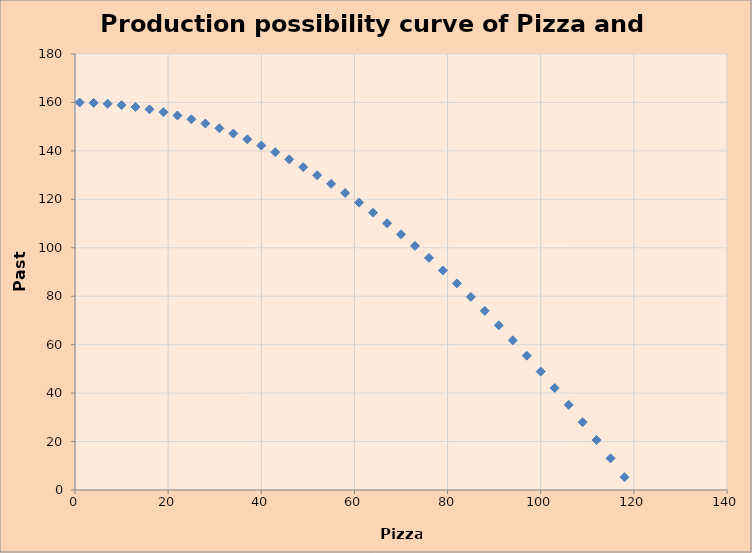
| Category | Y |
|---|---|
| 1.0 | 159.989 |
| 4.0 | 159.822 |
| 7.0 | 159.456 |
| 10.0 | 158.889 |
| 13.0 | 158.122 |
| 16.0 | 157.156 |
| 19.0 | 155.989 |
| 22.0 | 154.622 |
| 25.0 | 153.056 |
| 28.0 | 151.289 |
| 31.0 | 149.322 |
| 34.0 | 147.156 |
| 37.0 | 144.789 |
| 40.0 | 142.222 |
| 43.0 | 139.456 |
| 46.0 | 136.489 |
| 49.0 | 133.322 |
| 52.0 | 129.956 |
| 55.0 | 126.389 |
| 58.0 | 122.622 |
| 61.0 | 118.656 |
| 64.0 | 114.489 |
| 67.0 | 110.122 |
| 70.0 | 105.556 |
| 73.0 | 100.789 |
| 76.0 | 95.822 |
| 79.0 | 90.656 |
| 82.0 | 85.289 |
| 85.0 | 79.722 |
| 88.0 | 73.956 |
| 91.0 | 67.989 |
| 94.0 | 61.822 |
| 97.0 | 55.456 |
| 100.0 | 48.889 |
| 103.0 | 42.122 |
| 106.0 | 35.156 |
| 109.0 | 27.989 |
| 112.0 | 20.622 |
| 115.0 | 13.056 |
| 118.0 | 5.289 |